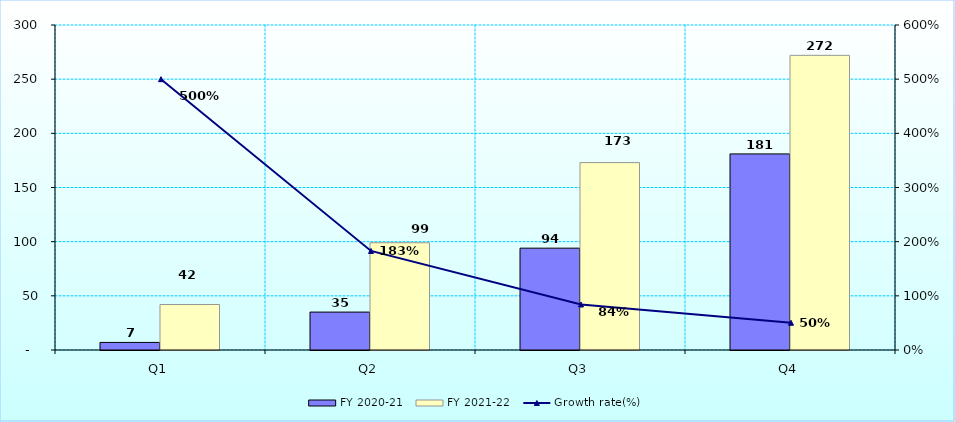
| Category | FY 2020-21 | FY 2021-22 |
|---|---|---|
| Q1 | 7 | 42 |
| Q2 | 35 | 99 |
| Q3 | 94 | 173 |
| Q4 | 181 | 272 |